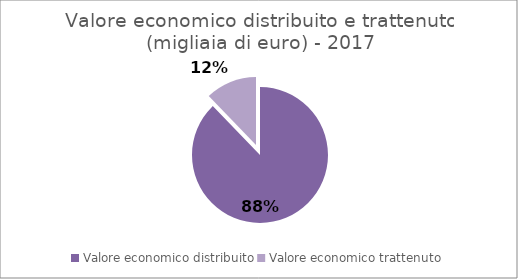
| Category | Series 1 |
|---|---|
| Valore economico distribuito | 2235339 |
| Valore economico trattenuto | 311367 |